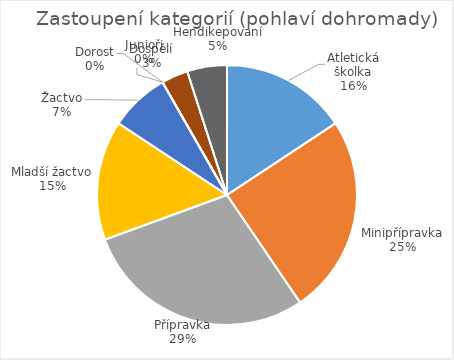
| Category | Series 0 |
|---|---|
| Atletická školka | 19 |
| Minipřípravka | 30 |
| Přípravka | 35 |
| Mladší žactvo | 18 |
| Žactvo | 9 |
| Dorost | 0 |
| Junioři | 0 |
| Dospělí | 4 |
| Hendikepovaní | 6 |